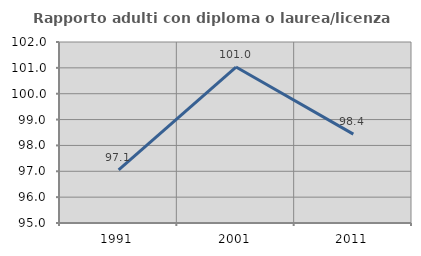
| Category | Rapporto adulti con diploma o laurea/licenza media  |
|---|---|
| 1991.0 | 97.059 |
| 2001.0 | 101.031 |
| 2011.0 | 98.438 |